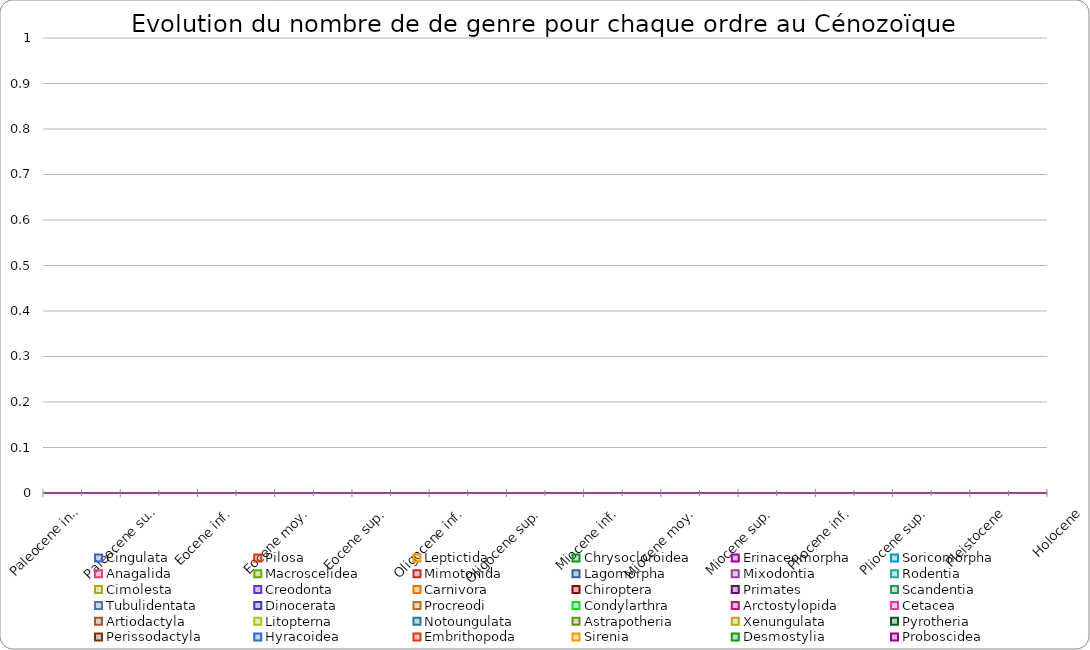
| Category | Cingulata | Pilosa | Leptictida | Chrysocloroidea | Erinaceomorpha | Soricomorpha | Anagalida | Macroscelidea | Mimotonida | Lagomorpha | Mixodontia | Rodentia | Cimolesta | Creodonta | Carnivora | Chiroptera | Primates | Scandentia | Tubulidentata | Dinocerata | Procreodi | Condylarthra | Arctostylopida | Cetacea | Artiodactyla | Litopterna | Notoungulata | Astrapotheria | Xenungulata | Pyrotheria | Perissodactyla | Hyracoidea | Embrithopoda | Sirenia | Desmostylia | Proboscidea |
|---|---|---|---|---|---|---|---|---|---|---|---|---|---|---|---|---|---|---|---|---|---|---|---|---|---|---|---|---|---|---|---|---|---|---|---|---|
| Paleocene inf. | 0 | 0 | 0 | 0 | 0 | 0 | 0 | 0 | 0 | 0 | 0 | 0 | 0 | 0 | 0 | 0 | 0 | 0 | 0 | 0 | 0 | 0 | 0 | 0 | 0 | 0 | 0 | 0 | 0 | 0 | 0 | 0 | 0 | 0 | 0 | 0 |
|  Paleocene sup. | 0 | 0 | 0 | 0 | 0 | 0 | 0 | 0 | 0 | 0 | 0 | 0 | 0 | 0 | 0 | 0 | 0 | 0 | 0 | 0 | 0 | 0 | 0 | 0 | 0 | 0 | 0 | 0 | 0 | 0 | 0 | 0 | 0 | 0 | 0 | 0 |
| Eocene inf. | 0 | 0 | 0 | 0 | 0 | 0 | 0 | 0 | 0 | 0 | 0 | 0 | 0 | 0 | 0 | 0 | 0 | 0 | 0 | 0 | 0 | 0 | 0 | 0 | 0 | 0 | 0 | 0 | 0 | 0 | 0 | 0 | 0 | 0 | 0 | 0 |
| Eocene moy. | 0 | 0 | 0 | 0 | 0 | 0 | 0 | 0 | 0 | 0 | 0 | 0 | 0 | 0 | 0 | 0 | 0 | 0 | 0 | 0 | 0 | 0 | 0 | 0 | 0 | 0 | 0 | 0 | 0 | 0 | 0 | 0 | 0 | 0 | 0 | 0 |
| Eocene sup. | 0 | 0 | 0 | 0 | 0 | 0 | 0 | 0 | 0 | 0 | 0 | 0 | 0 | 0 | 0 | 0 | 0 | 0 | 0 | 0 | 0 | 0 | 0 | 0 | 0 | 0 | 0 | 0 | 0 | 0 | 0 | 0 | 0 | 0 | 0 | 0 |
| Oligocene inf. | 0 | 0 | 0 | 0 | 0 | 0 | 0 | 0 | 0 | 0 | 0 | 0 | 0 | 0 | 0 | 0 | 0 | 0 | 0 | 0 | 0 | 0 | 0 | 0 | 0 | 0 | 0 | 0 | 0 | 0 | 0 | 0 | 0 | 0 | 0 | 0 |
| Oligocene sup. | 0 | 0 | 0 | 0 | 0 | 0 | 0 | 0 | 0 | 0 | 0 | 0 | 0 | 0 | 0 | 0 | 0 | 0 | 0 | 0 | 0 | 0 | 0 | 0 | 0 | 0 | 0 | 0 | 0 | 0 | 0 | 0 | 0 | 0 | 0 | 0 |
| Miocene inf. | 0 | 0 | 0 | 0 | 0 | 0 | 0 | 0 | 0 | 0 | 0 | 0 | 0 | 0 | 0 | 0 | 0 | 0 | 0 | 0 | 0 | 0 | 0 | 0 | 0 | 0 | 0 | 0 | 0 | 0 | 0 | 0 | 0 | 0 | 0 | 0 |
| Miocene moy. | 0 | 0 | 0 | 0 | 0 | 0 | 0 | 0 | 0 | 0 | 0 | 0 | 0 | 0 | 0 | 0 | 0 | 0 | 0 | 0 | 0 | 0 | 0 | 0 | 0 | 0 | 0 | 0 | 0 | 0 | 0 | 0 | 0 | 0 | 0 | 0 |
| Miocene sup. | 0 | 0 | 0 | 0 | 0 | 0 | 0 | 0 | 0 | 0 | 0 | 0 | 0 | 0 | 0 | 0 | 0 | 0 | 0 | 0 | 0 | 0 | 0 | 0 | 0 | 0 | 0 | 0 | 0 | 0 | 0 | 0 | 0 | 0 | 0 | 0 |
| Pliocene inf. | 0 | 0 | 0 | 0 | 0 | 0 | 0 | 0 | 0 | 0 | 0 | 0 | 0 | 0 | 0 | 0 | 0 | 0 | 0 | 0 | 0 | 0 | 0 | 0 | 0 | 0 | 0 | 0 | 0 | 0 | 0 | 0 | 0 | 0 | 0 | 0 |
| Pliocene sup. | 0 | 0 | 0 | 0 | 0 | 0 | 0 | 0 | 0 | 0 | 0 | 0 | 0 | 0 | 0 | 0 | 0 | 0 | 0 | 0 | 0 | 0 | 0 | 0 | 0 | 0 | 0 | 0 | 0 | 0 | 0 | 0 | 0 | 0 | 0 | 0 |
| Pleistocene | 0 | 0 | 0 | 0 | 0 | 0 | 0 | 0 | 0 | 0 | 0 | 0 | 0 | 0 | 0 | 0 | 0 | 0 | 0 | 0 | 0 | 0 | 0 | 0 | 0 | 0 | 0 | 0 | 0 | 0 | 0 | 0 | 0 | 0 | 0 | 0 |
| Holocene | 0 | 0 | 0 | 0 | 0 | 0 | 0 | 0 | 0 | 0 | 0 | 0 | 0 | 0 | 0 | 0 | 0 | 0 | 0 | 0 | 0 | 0 | 0 | 0 | 0 | 0 | 0 | 0 | 0 | 0 | 0 | 0 | 0 | 0 | 0 | 0 |